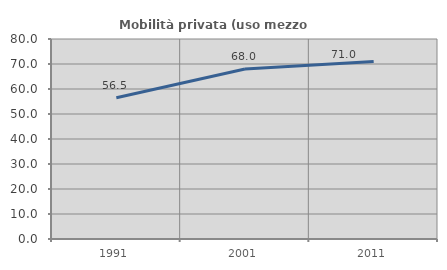
| Category | Mobilità privata (uso mezzo privato) |
|---|---|
| 1991.0 | 56.513 |
| 2001.0 | 67.979 |
| 2011.0 | 71.002 |